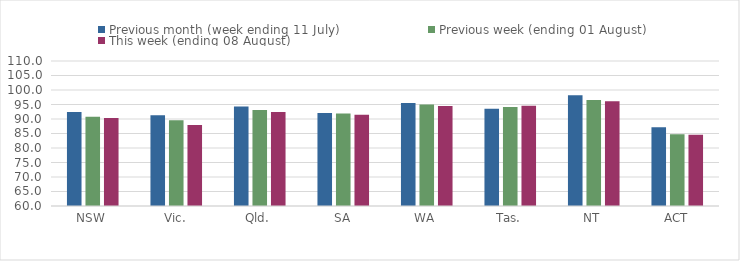
| Category | Previous month (week ending 11 July) | Previous week (ending 01 August) | This week (ending 08 August) |
|---|---|---|---|
| NSW | 92.371 | 90.739 | 90.329 |
| Vic. | 91.283 | 89.536 | 87.949 |
| Qld. | 94.287 | 93.132 | 92.384 |
| SA | 92.068 | 91.894 | 91.469 |
| WA | 95.542 | 94.996 | 94.506 |
| Tas. | 93.575 | 94.179 | 94.55 |
| NT | 98.224 | 96.559 | 96.113 |
| ACT | 87.133 | 84.707 | 84.559 |